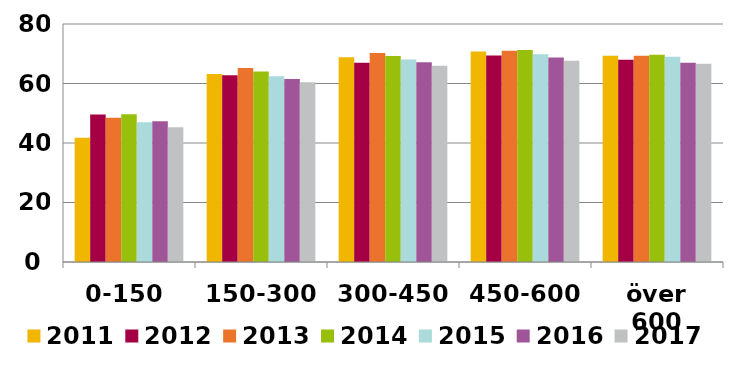
| Category | 2011 | 2012 | 2013 | 2014 | 2015 | 2016 | 2017 |
|---|---|---|---|---|---|---|---|
| 0-150 | 41.726 | 49.55 | 48.526 | 49.631 | 47.004 | 47.323 | 45.313 |
| 150-300 | 63.169 | 62.781 | 65.229 | 63.999 | 62.397 | 61.532 | 60.424 |
| 300-450 | 68.823 | 66.969 | 70.242 | 69.229 | 68.034 | 67.13 | 65.959 |
| 450-600 | 70.786 | 69.406 | 70.997 | 71.282 | 69.835 | 68.743 | 67.616 |
| över 600 | 69.337 | 67.984 | 69.299 | 69.639 | 68.961 | 66.939 | 66.667 |